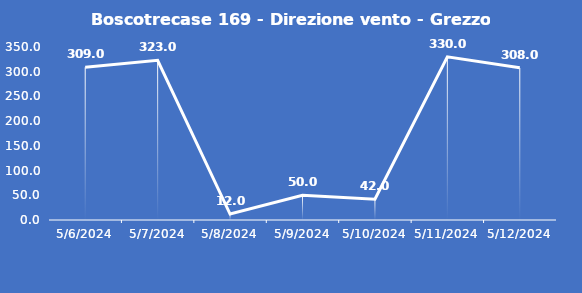
| Category | Boscotrecase 169 - Direzione vento - Grezzo (°N) |
|---|---|
| 5/6/24 | 309 |
| 5/7/24 | 323 |
| 5/8/24 | 12 |
| 5/9/24 | 50 |
| 5/10/24 | 42 |
| 5/11/24 | 330 |
| 5/12/24 | 308 |